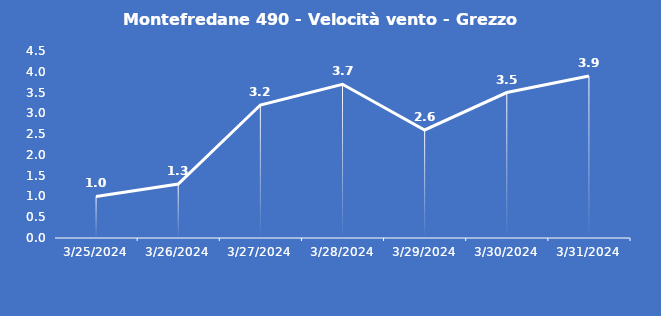
| Category | Montefredane 490 - Velocità vento - Grezzo (m/s) |
|---|---|
| 3/25/24 | 1 |
| 3/26/24 | 1.3 |
| 3/27/24 | 3.2 |
| 3/28/24 | 3.7 |
| 3/29/24 | 2.6 |
| 3/30/24 | 3.5 |
| 3/31/24 | 3.9 |